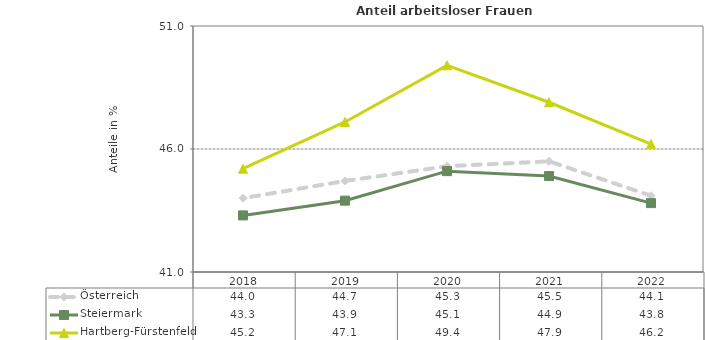
| Category | Österreich | Steiermark | Hartberg-Fürstenfeld |
|---|---|---|---|
| 2022.0 | 44.1 | 43.8 | 46.2 |
| 2021.0 | 45.5 | 44.9 | 47.9 |
| 2020.0 | 45.3 | 45.1 | 49.4 |
| 2019.0 | 44.7 | 43.9 | 47.1 |
| 2018.0 | 44 | 43.3 | 45.2 |